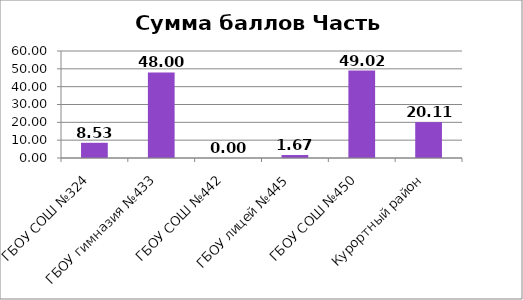
| Category | Сумма баллов Часть 2 |
|---|---|
| ГБОУ СОШ №324 | 8.527 |
| ГБОУ гимназия №433 | 48 |
| ГБОУ СОШ №442 | 0 |
| ГБОУ лицей №445 | 1.667 |
| ГБОУ СОШ №450 | 49.02 |
| Курортный район | 20.11 |